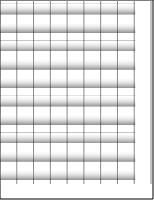
| Category | Series 0 |
|---|---|
| 0 | 8 |
| 1 | 8 |
| 2 | 8 |
| 3 | 8 |
| 4 | 8 |
| 5 | 8 |
| 6 | 8 |
| 7 | 8 |
| 8 | 8 |
| 9 | 8 |